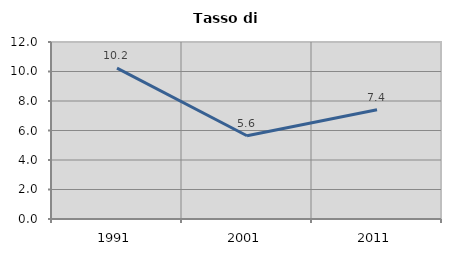
| Category | Tasso di disoccupazione   |
|---|---|
| 1991.0 | 10.229 |
| 2001.0 | 5.645 |
| 2011.0 | 7.405 |